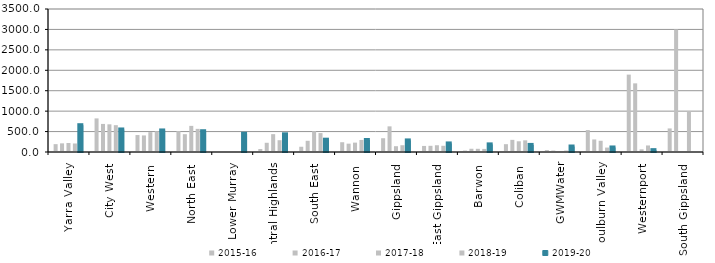
| Category | 2015-16 | 2016-17 | 2017-18 | 2018-19 | 2019-20 |
|---|---|---|---|---|---|
| Yarra Valley  | 192.403 | 211.594 | 220.302 | 208.616 | 655.883 |
| City West  | 822.254 | 687.099 | 677.288 | 656.346 | 551.427 |
| Western  | 414.684 | 405.716 | 486.273 | 508.097 | 527.344 |
| North East  | 512.37 | 435.688 | 639.419 | 566.321 | 508.503 |
| Lower Murray  | 0 | 0 | 0 | 0 | 446 |
| Central Highlands  | 72.67 | 225.575 | 436.904 | 288.667 | 432.586 |
| South East  | 128.279 | 274.003 | 509.247 | 462.877 | 301.354 |
| Wannon  | 239.256 | 204.438 | 229.459 | 294.75 | 293.711 |
| Gippsland  | 337.091 | 627.822 | 141.99 | 165.947 | 283.507 |
| East Gippsland  | 148.316 | 151.295 | 165.427 | 151.986 | 209.754 |
| Barwon  | 34.802 | 79.14 | 78.241 | 75.476 | 186.398 |
| Coliban  | 191.542 | 296.972 | 262.222 | 285.521 | 173.326 |
| GWMWater | 47.279 | 35.6 | 5.724 | 35.306 | 134.534 |
| Goulburn Valley  | 536.892 | 307.161 | 274.58 | 108.326 | 110.882 |
| Westernport  | 1894.2 | 1680 | 64.831 | 160 | 45.327 |
| South Gippsland  | 576.667 | 3000 | 0 | 1000 | 0 |